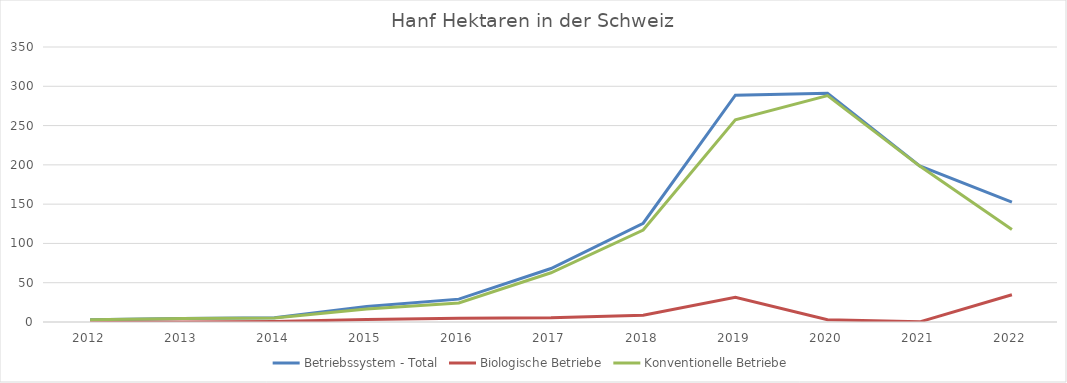
| Category | Betriebssystem - Total | Biologische Betriebe | Konventionelle Betriebe |
|---|---|---|---|
| 2012 | 2.97 | 0 | 2.97 |
| 2013 | 4.38 | 0 | 4.38 |
| 2014 | 5.56 | 0.49 | 5.07 |
| 2015 | 19.72 | 3.06 | 16.66 |
| 2016 | 29.09 | 4.77 | 24.32 |
| 2017 | 68.07 | 5.39 | 62.68 |
| 2018 | 125.7 | 8.72 | 116.98 |
| 2019 | 288.74 | 31.47 | 257.27 |
| 2020 | 291.05 | 2.94 | 288.12 |
| 2021 | 198.64 | 0.22 | 198.41 |
| 2022 | 152.5 | 34.67 | 117.83 |